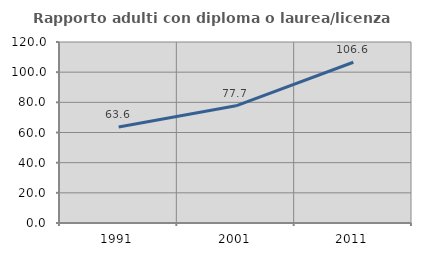
| Category | Rapporto adulti con diploma o laurea/licenza media  |
|---|---|
| 1991.0 | 63.636 |
| 2001.0 | 77.686 |
| 2011.0 | 106.564 |